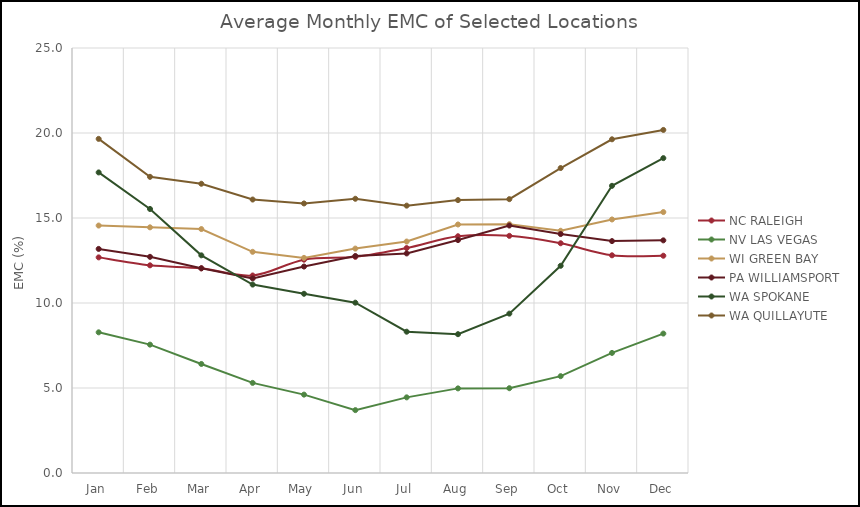
| Category | NC RALEIGH | NV LAS VEGAS | WI GREEN BAY | PA WILLIAMSPORT | WA SPOKANE | WA QUILLAYUTE |
|---|---|---|---|---|---|---|
| Jan | 12.684 | 8.274 | 14.556 | 13.181 | 17.68 | 19.654 |
| Feb | 12.216 | 7.551 | 14.451 | 12.716 | 15.531 | 17.422 |
| Mar | 12.041 | 6.414 | 14.35 | 12.041 | 12.804 | 17.015 |
| Apr | 11.617 | 5.301 | 13.01 | 11.446 | 11.084 | 16.086 |
| May | 12.549 | 4.611 | 12.654 | 12.144 | 10.543 | 15.856 |
| Jun | 12.714 | 3.698 | 13.201 | 12.766 | 10.019 | 16.131 |
| Jul | 13.233 | 4.449 | 13.615 | 12.916 | 8.312 | 15.727 |
| Aug | 13.926 | 4.977 | 14.619 | 13.701 | 8.166 | 16.052 |
| Sep | 13.951 | 4.988 | 14.635 | 14.557 | 9.375 | 16.109 |
| Oct | 13.514 | 5.696 | 14.25 | 14.056 | 12.189 | 17.94 |
| Nov | 12.806 | 7.064 | 14.914 | 13.641 | 16.893 | 19.629 |
| Dec | 12.781 | 8.201 | 15.349 | 13.684 | 18.522 | 20.18 |